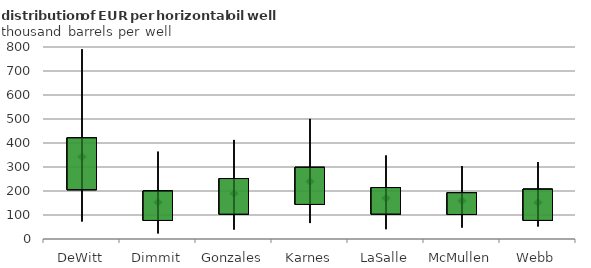
| Category | Mean |
|---|---|
| DeWitt | 341.949 |
| Dimmit | 153.208 |
| Gonzales | 189.882 |
| Karnes | 239.881 |
| LaSalle | 170.06 |
| McMullen | 158.514 |
| Webb | 151.188 |